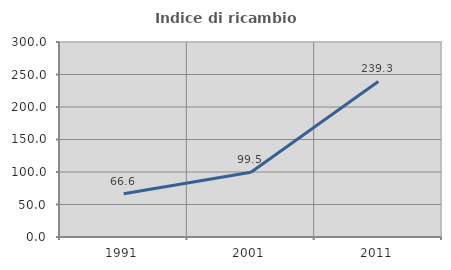
| Category | Indice di ricambio occupazionale  |
|---|---|
| 1991.0 | 66.648 |
| 2001.0 | 99.485 |
| 2011.0 | 239.264 |